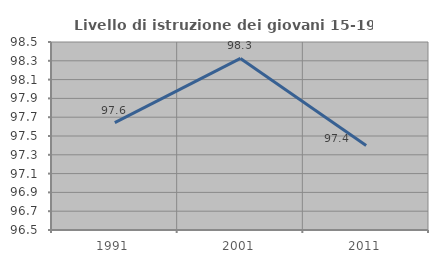
| Category | Livello di istruzione dei giovani 15-19 anni |
|---|---|
| 1991.0 | 97.642 |
| 2001.0 | 98.325 |
| 2011.0 | 97.399 |